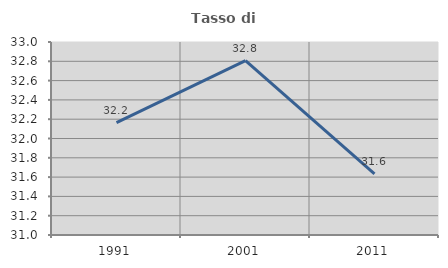
| Category | Tasso di occupazione   |
|---|---|
| 1991.0 | 32.164 |
| 2001.0 | 32.806 |
| 2011.0 | 31.633 |